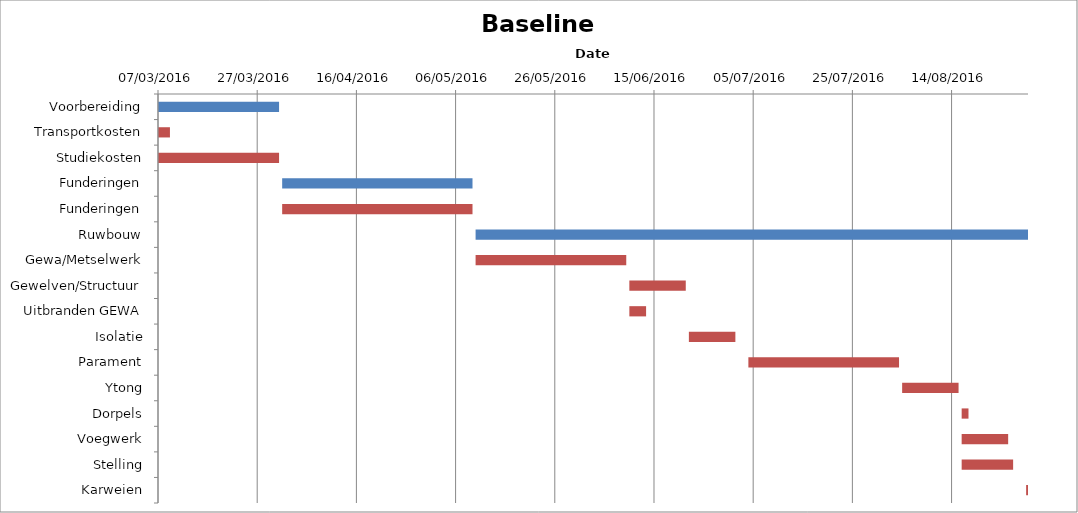
| Category | Baseline start | Actual duration |
|---|---|---|
| Voorbereiding | 42436.333 | 24.375 |
| Transportkosten | 42436.333 | 2.375 |
| Studiekosten | 42436.333 | 24.375 |
| Funderingen | 42461.333 | 38.375 |
| Funderingen | 42461.333 | 38.375 |
| Ruwbouw | 42500.333 | 111.375 |
| Gewa/Metselwerk | 42500.333 | 30.375 |
| Gewelven/Structuur | 42531.333 | 11.375 |
| Uitbranden GEWA | 42531.333 | 3.375 |
| Isolatie | 42543.333 | 9.375 |
| Parament | 42555.333 | 30.375 |
| Ytong | 42586.333 | 11.375 |
| Dorpels | 42598.333 | 1.375 |
| Voegwerk | 42598.333 | 9.375 |
| Stelling | 42598.333 | 10.375 |
| Karweien | 42611.333 | 0.375 |